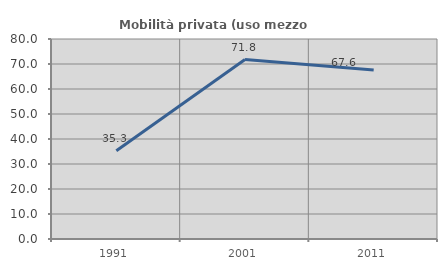
| Category | Mobilità privata (uso mezzo privato) |
|---|---|
| 1991.0 | 35.294 |
| 2001.0 | 71.795 |
| 2011.0 | 67.647 |